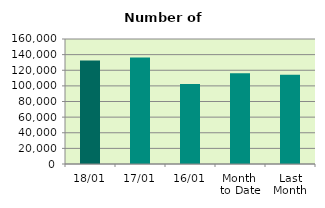
| Category | Series 0 |
|---|---|
| 18/01 | 132372 |
| 17/01 | 136190 |
| 16/01 | 102246 |
| Month 
to Date | 116206.308 |
| Last
Month | 114251.429 |